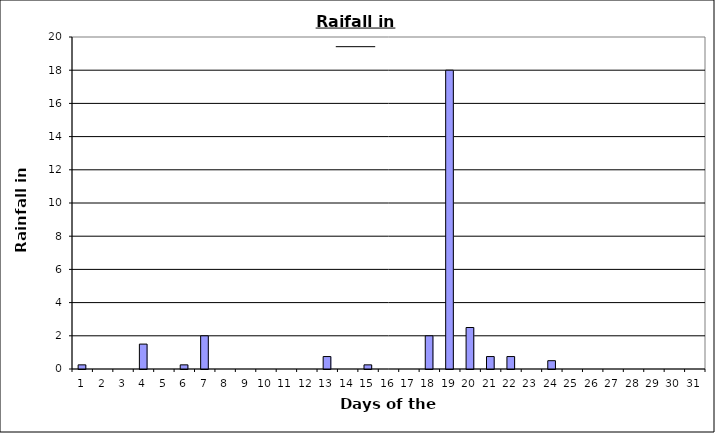
| Category | Series 0 |
|---|---|
| 0 | 0.25 |
| 1 | 0 |
| 2 | 0 |
| 3 | 1.5 |
| 4 | 0 |
| 5 | 0.25 |
| 6 | 2 |
| 7 | 0 |
| 8 | 0 |
| 9 | 0 |
| 10 | 0 |
| 11 | 0 |
| 12 | 0.75 |
| 13 | 0 |
| 14 | 0.25 |
| 15 | 0 |
| 16 | 0 |
| 17 | 2 |
| 18 | 18 |
| 19 | 2.5 |
| 20 | 0.75 |
| 21 | 0.75 |
| 22 | 0 |
| 23 | 0.5 |
| 24 | 0 |
| 25 | 0 |
| 26 | 0 |
| 27 | 0 |
| 28 | 0 |
| 29 | 0 |
| 30 | 0 |